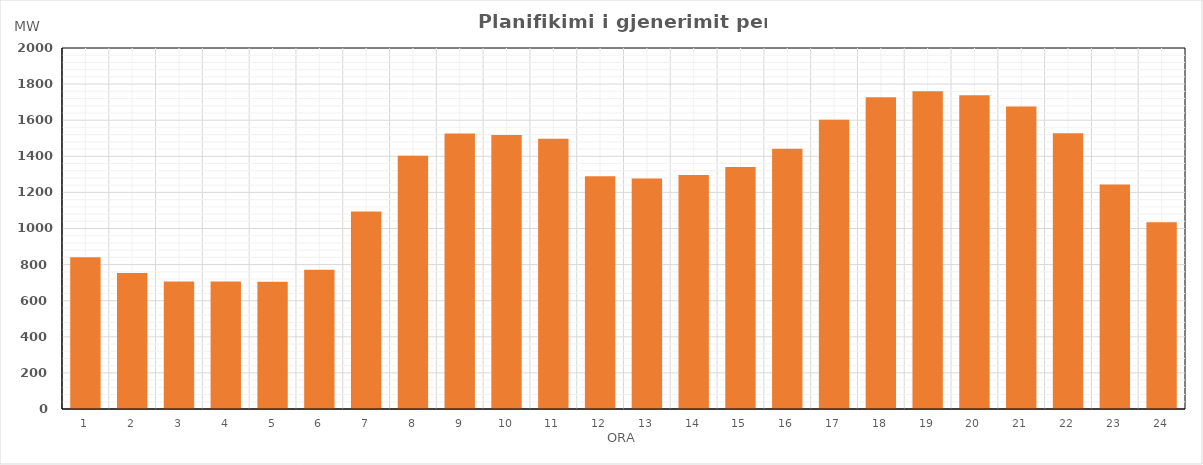
| Category | Max (MW) |
|---|---|
| 0 | 841.19 |
| 1 | 753.79 |
| 2 | 706.37 |
| 3 | 706.19 |
| 4 | 704.49 |
| 5 | 770.79 |
| 6 | 1094.83 |
| 7 | 1403.21 |
| 8 | 1526.17 |
| 9 | 1517.58 |
| 10 | 1496.98 |
| 11 | 1290.13 |
| 12 | 1277.57 |
| 13 | 1296.07 |
| 14 | 1340.26 |
| 15 | 1442.21 |
| 16 | 1603.05 |
| 17 | 1727.31 |
| 18 | 1760.31 |
| 19 | 1737.64 |
| 20 | 1675.93 |
| 21 | 1527.85 |
| 22 | 1243.86 |
| 23 | 1033.96 |